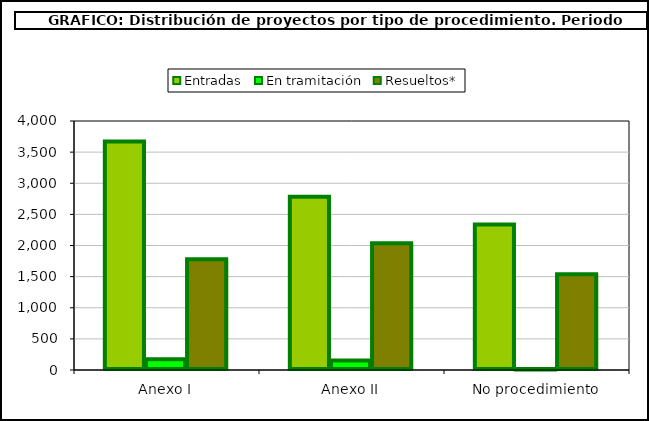
| Category | Entradas | En tramitación | Resueltos* |
|---|---|---|---|
| Anexo I | 3672 | 173 | 1781 |
| Anexo II | 2785 | 153 | 2035 |
| No procedimiento | 2336 | 7 | 1538 |